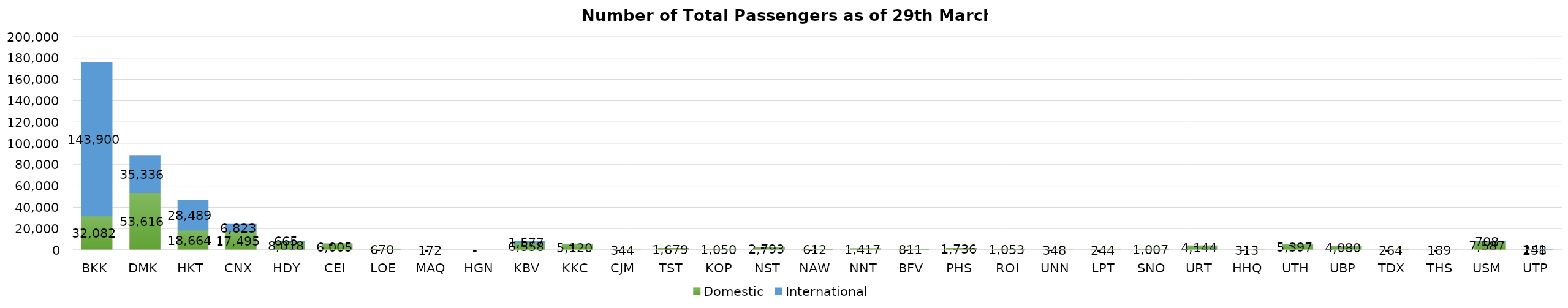
| Category | Domestic | International |
|---|---|---|
| BKK | 32082 | 143900 |
| DMK | 53616 | 35336 |
| HKT | 18664 | 28489 |
| CNX | 17495 | 6823 |
| HDY | 8018 | 665 |
| CEI | 6005 | 0 |
| LOE | 670 | 0 |
| MAQ | 172 | 0 |
| HGN | 0 | 0 |
| KBV | 6558 | 1577 |
| KKC | 5120 | 0 |
| CJM | 344 | 0 |
| TST | 1679 | 0 |
| KOP | 1050 | 0 |
| NST | 2793 | 0 |
| NAW | 612 | 0 |
| NNT | 1417 | 0 |
| BFV | 811 | 0 |
| PHS | 1736 | 0 |
| ROI | 1053 | 0 |
| UNN | 348 | 0 |
| LPT | 244 | 0 |
| SNO | 1007 | 0 |
| URT | 4144 | 0 |
| HHQ | 313 | 0 |
| UTH | 5397 | 0 |
| UBP | 4080 | 0 |
| TDX | 264 | 0 |
| THS | 189 | 0 |
| USM | 7587 | 708 |
| UTP | 258 | 141 |